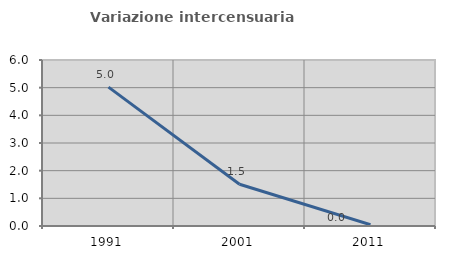
| Category | Variazione intercensuaria annua |
|---|---|
| 1991.0 | 5.02 |
| 2001.0 | 1.507 |
| 2011.0 | 0.046 |